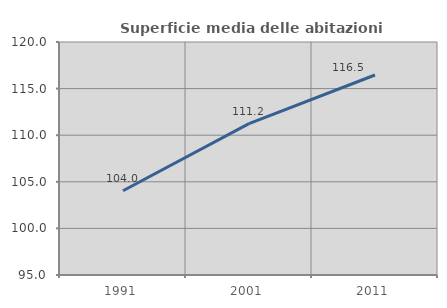
| Category | Superficie media delle abitazioni occupate |
|---|---|
| 1991.0 | 104.04 |
| 2001.0 | 111.234 |
| 2011.0 | 116.458 |